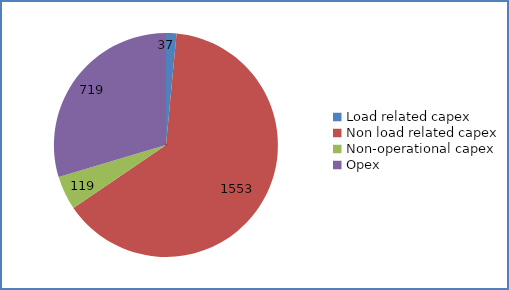
| Category | Series 0 |
|---|---|
| Load related capex | 36.615 |
| Non load related capex | 1552.898 |
| Non-operational capex | 118.821 |
| Opex | 718.851 |